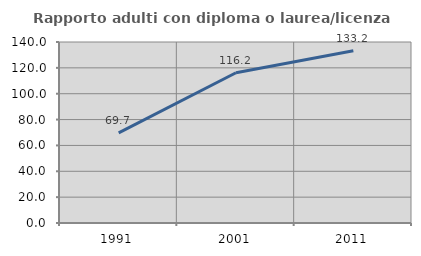
| Category | Rapporto adulti con diploma o laurea/licenza media  |
|---|---|
| 1991.0 | 69.722 |
| 2001.0 | 116.192 |
| 2011.0 | 133.23 |